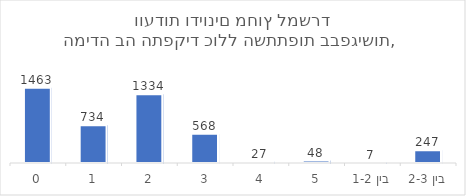
| Category | סה"כ |
|---|---|
| 0 | 1463 |
| 1 | 734 |
| 2 | 1334 |
| 3 | 568 |
| 4 | 27 |
| 5 | 48 |
| בין 1-2 | 7 |
| בין 2-3 | 247 |